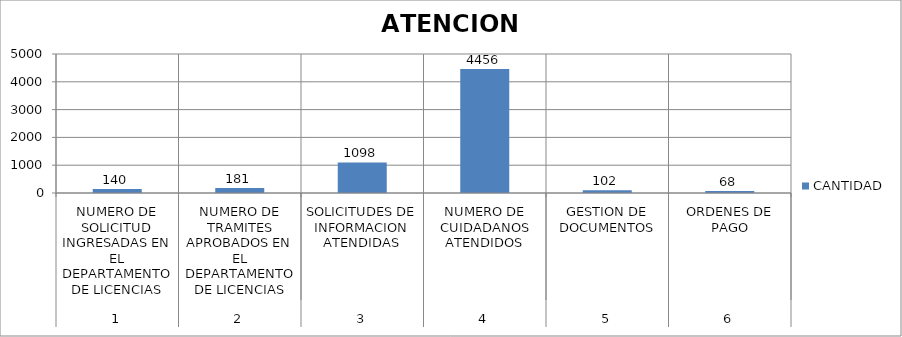
| Category | CANTIDAD |
|---|---|
| 0 | 140 |
| 1 | 181 |
| 2 | 1098 |
| 3 | 4456 |
| 4 | 102 |
| 5 | 68 |